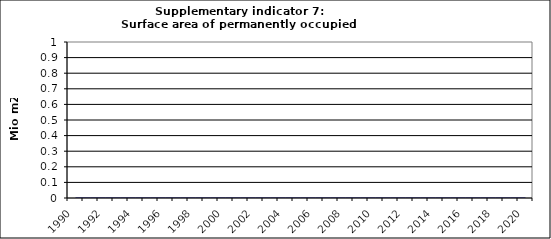
| Category | Surface area of permanently occupied dwellings, Mio m2  |
|---|---|
| 1990 | 0 |
| 1991 | 0 |
| 1992 | 0 |
| 1993 | 0 |
| 1994 | 0 |
| 1995 | 0 |
| 1996 | 0 |
| 1997 | 0 |
| 1998 | 0 |
| 1999 | 0 |
| 2000 | 0 |
| 2001 | 0 |
| 2002 | 0 |
| 2003 | 0 |
| 2004 | 0 |
| 2005 | 0 |
| 2006 | 0 |
| 2007 | 0 |
| 2008 | 0 |
| 2009 | 0 |
| 2010 | 0 |
| 2011 | 0 |
| 2012 | 0 |
| 2013 | 0 |
| 2014 | 0 |
| 2015 | 0 |
| 2016 | 0 |
| 2017 | 0 |
| 2018 | 0 |
| 2019 | 0 |
| 2020 | 0 |